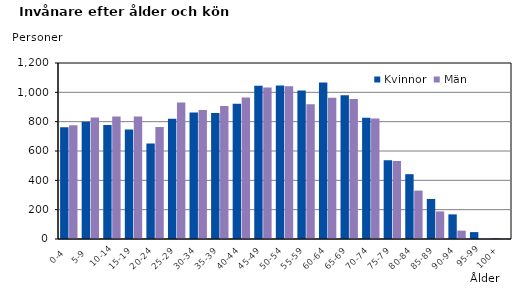
| Category | Kvinnor | Män |
|---|---|---|
|   0-4  | 762 | 775 |
|   5-9  | 800 | 828 |
| 10-14 | 778 | 836 |
| 15-19  | 746 | 836 |
| 20-24  | 651 | 764 |
| 25-29  | 820 | 931 |
| 30-34  | 862 | 879 |
| 35-39  | 859 | 906 |
| 40-44  | 922 | 964 |
| 45-49  | 1045 | 1033 |
| 50-54  | 1046 | 1041 |
| 55-59  | 1012 | 919 |
| 60-64  | 1067 | 963 |
| 65-69  | 980 | 955 |
| 70-74  | 827 | 821 |
| 75-79  | 537 | 532 |
| 80-84  | 442 | 330 |
| 85-89  | 273 | 188 |
| 90-94  | 168 | 57 |
| 95-99 | 47 | 7 |
| 100+ | 3 | 2 |